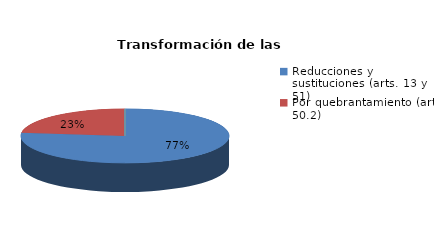
| Category | Series 0 |
|---|---|
| Reducciones y sustituciones (arts. 13 y 51) | 10 |
| Por quebrantamiento (art. 50.2) | 3 |
| Cancelaciones anticipadas | 0 |
| Traslado a Centros Penitenciarios | 0 |
| Conversión internamientos en cerrados (art. 51.2) | 0 |